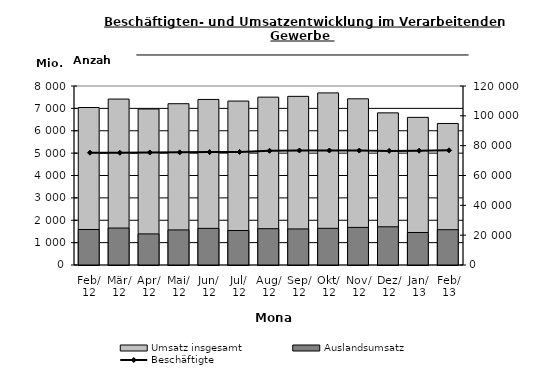
| Category | Umsatz insgesamt | Auslandsumsatz |
|---|---|---|
| 2012-02-01 | 7038.621 | 1586.306 |
| 2012-03-01 | 7416.484 | 1651.678 |
| 2012-04-01 | 6972.158 | 1389.091 |
| 2012-05-01 | 7208.203 | 1567.272 |
| 2012-06-01 | 7399.131 | 1636.887 |
| 2012-07-01 | 7327.339 | 1540.606 |
| 2012-08-01 | 7501.535 | 1622.307 |
| 2012-09-01 | 7537.073 | 1611.325 |
| 2012-10-01 | 7691.386 | 1638.671 |
| 2012-11-01 | 7427.668 | 1680.559 |
| 2012-12-01 | 6799.178 | 1707.786 |
| 2013-01-01 | 6598.983 | 1453.122 |
| 2013-02-01 | 6326.057 | 1578.148 |